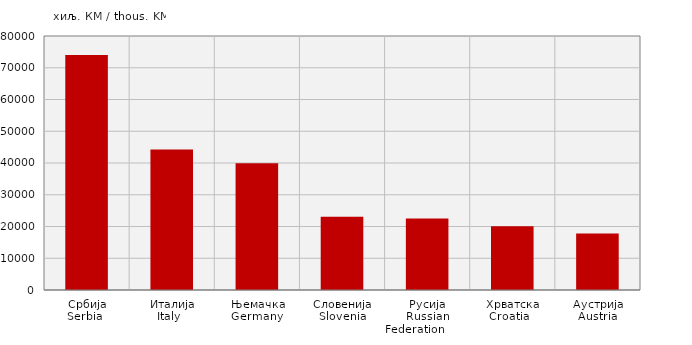
| Category | Увоз
Import |
|---|---|
| Србија
Serbia   | 73980 |
| Италија
Italy   | 44264 |
| Њемачка
Germany  | 39923 |
| Словенија
Slovenia | 23034 |
| Русија
Russian Federation            | 22552 |
| Хрватска
Croatia   | 20051 |
| Аустрија
Austria | 17793 |